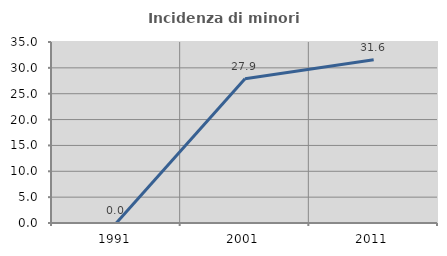
| Category | Incidenza di minori stranieri |
|---|---|
| 1991.0 | 0 |
| 2001.0 | 27.907 |
| 2011.0 | 31.579 |